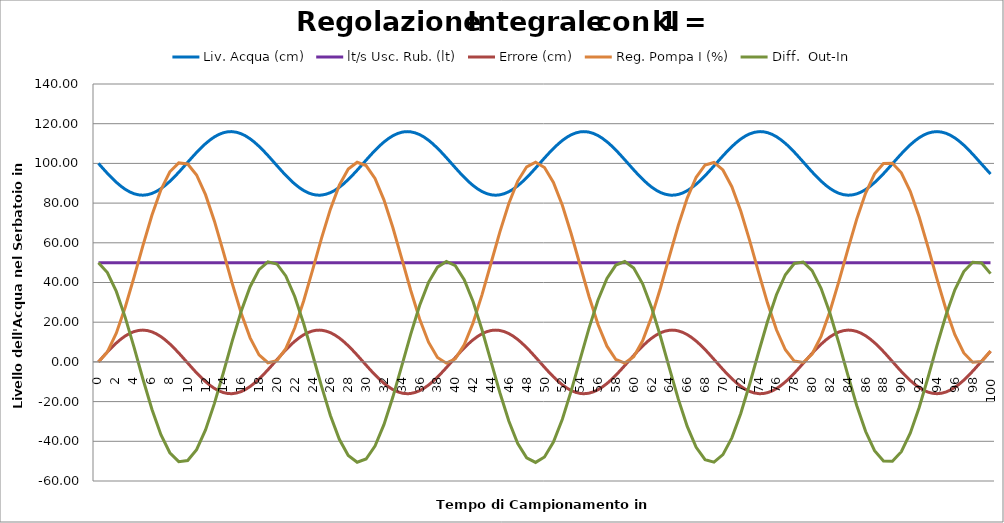
| Category | Liv. Acqua (cm) | lt/s Usc. Rub. (lt) | Errore (cm) | Reg. Pompa I (%) | Diff.  Out-In |
|---|---|---|---|---|---|
| 0.0 | 100 | 50 | 0 | 0 | 50 |
| 1.0 | 95 | 50 | 5 | 5 | 45 |
| 2.0 | 90.5 | 50 | 9.5 | 14.5 | 35.5 |
| 3.0 | 86.95 | 50 | 13.05 | 27.55 | 22.45 |
| 4.0 | 84.705 | 50 | 15.295 | 42.845 | 7.155 |
| 5.0 | 83.989 | 50 | 16.011 | 58.856 | -8.856 |
| 6.0 | 84.875 | 50 | 15.125 | 73.98 | -23.98 |
| 7.0 | 87.273 | 50 | 12.727 | 86.707 | -36.707 |
| 8.0 | 90.944 | 50 | 9.056 | 95.764 | -45.764 |
| 9.0 | 95.52 | 50 | 4.48 | 100.243 | -50.243 |
| 10.0 | 100.545 | 50 | -0.545 | 99.699 | -49.699 |
| 11.0 | 105.514 | 50 | -5.514 | 94.184 | -44.184 |
| 12.0 | 109.933 | 50 | -9.933 | 84.252 | -34.252 |
| 13.0 | 113.358 | 50 | -13.358 | 70.894 | -20.894 |
| 14.0 | 115.447 | 50 | -15.447 | 55.446 | -5.446 |
| 15.0 | 115.992 | 50 | -15.992 | 39.454 | 10.546 |
| 16.0 | 114.937 | 50 | -14.937 | 24.517 | 25.483 |
| 17.0 | 112.389 | 50 | -12.389 | 12.128 | 37.872 |
| 18.0 | 108.602 | 50 | -8.602 | 3.526 | 46.474 |
| 19.0 | 103.954 | 50 | -3.954 | -0.429 | 50.429 |
| 20.0 | 98.912 | 50 | 1.088 | 0.66 | 49.34 |
| 21.0 | 93.978 | 50 | 6.022 | 6.682 | 43.318 |
| 22.0 | 89.646 | 50 | 10.354 | 17.036 | 32.964 |
| 23.0 | 86.349 | 50 | 13.651 | 30.687 | 19.313 |
| 24.0 | 84.418 | 50 | 15.582 | 46.269 | 3.731 |
| 25.0 | 84.045 | 50 | 15.955 | 62.224 | -12.224 |
| 26.0 | 85.267 | 50 | 14.733 | 76.956 | -26.956 |
| 27.0 | 87.963 | 50 | 12.037 | 88.993 | -38.993 |
| 28.0 | 91.862 | 50 | 8.138 | 97.131 | -47.131 |
| 29.0 | 96.575 | 50 | 3.425 | 100.555 | -50.555 |
| 30.0 | 101.631 | 50 | -1.631 | 98.924 | -48.924 |
| 31.0 | 106.523 | 50 | -6.523 | 92.401 | -42.401 |
| 32.0 | 110.764 | 50 | -10.764 | 81.637 | -31.637 |
| 33.0 | 113.927 | 50 | -13.927 | 67.71 | -17.71 |
| 34.0 | 115.698 | 50 | -15.698 | 52.012 | -2.012 |
| 35.0 | 115.899 | 50 | -15.899 | 36.112 | 13.888 |
| 36.0 | 114.511 | 50 | -14.511 | 21.602 | 28.398 |
| 37.0 | 111.671 | 50 | -11.671 | 9.931 | 40.069 |
| 38.0 | 107.664 | 50 | -7.664 | 2.267 | 47.733 |
| 39.0 | 102.891 | 50 | -2.891 | -0.624 | 50.624 |
| 40.0 | 97.828 | 50 | 2.172 | 1.548 | 48.452 |
| 41.0 | 92.983 | 50 | 7.017 | 8.565 | 41.435 |
| 42.0 | 88.84 | 50 | 11.16 | 19.725 | 30.275 |
| 43.0 | 85.812 | 50 | 14.188 | 33.913 | 16.087 |
| 44.0 | 84.203 | 50 | 15.797 | 49.71 | 0.29 |
| 45.0 | 84.174 | 50 | 15.826 | 65.536 | -15.536 |
| 46.0 | 85.728 | 50 | 14.272 | 79.808 | -29.808 |
| 47.0 | 88.709 | 50 | 11.291 | 91.099 | -41.099 |
| 48.0 | 92.819 | 50 | 7.181 | 98.28 | -48.28 |
| 49.0 | 97.647 | 50 | 2.353 | 100.634 | -50.634 |
| 50.0 | 102.71 | 50 | -2.71 | 97.924 | -47.924 |
| 51.0 | 107.502 | 50 | -7.502 | 90.421 | -40.421 |
| 52.0 | 111.545 | 50 | -11.545 | 78.877 | -28.877 |
| 53.0 | 114.432 | 50 | -14.432 | 64.445 | -14.445 |
| 54.0 | 115.877 | 50 | -15.877 | 48.568 | 1.432 |
| 55.0 | 115.733 | 50 | -15.733 | 32.835 | 17.165 |
| 56.0 | 114.017 | 50 | -14.017 | 18.818 | 31.182 |
| 57.0 | 110.899 | 50 | -10.899 | 7.919 | 42.081 |
| 58.0 | 106.691 | 50 | -6.691 | 1.228 | 48.772 |
| 59.0 | 101.813 | 50 | -1.813 | -0.585 | 50.585 |
| 60.0 | 96.755 | 50 | 3.245 | 2.66 | 47.34 |
| 61.0 | 92.021 | 50 | 7.979 | 10.639 | 39.361 |
| 62.0 | 88.085 | 50 | 11.915 | 22.554 | 27.446 |
| 63.0 | 85.34 | 50 | 14.66 | 37.214 | 12.786 |
| 64.0 | 84.062 | 50 | 15.938 | 53.152 | -3.152 |
| 65.0 | 84.377 | 50 | 15.623 | 68.776 | -18.776 |
| 66.0 | 86.254 | 50 | 13.746 | 82.521 | -32.521 |
| 67.0 | 89.507 | 50 | 10.493 | 93.014 | -43.014 |
| 68.0 | 93.808 | 50 | 6.192 | 99.206 | -49.206 |
| 69.0 | 98.729 | 50 | 1.271 | 100.478 | -50.478 |
| 70.0 | 103.776 | 50 | -3.776 | 96.701 | -46.701 |
| 71.0 | 108.447 | 50 | -8.447 | 88.255 | -38.255 |
| 72.0 | 112.272 | 50 | -12.272 | 75.983 | -25.983 |
| 73.0 | 114.87 | 50 | -14.87 | 61.112 | -11.112 |
| 74.0 | 115.982 | 50 | -15.982 | 45.131 | 4.869 |
| 75.0 | 115.495 | 50 | -15.495 | 29.636 | 20.364 |
| 76.0 | 113.458 | 50 | -13.458 | 16.178 | 33.822 |
| 77.0 | 110.076 | 50 | -10.076 | 6.102 | 43.898 |
| 78.0 | 105.686 | 50 | -5.686 | 0.416 | 49.584 |
| 79.0 | 100.728 | 50 | -0.728 | -0.312 | 50.312 |
| 80.0 | 95.697 | 50 | 4.303 | 3.991 | 46.009 |
| 81.0 | 91.096 | 50 | 8.904 | 12.895 | 37.105 |
| 82.0 | 87.385 | 50 | 12.615 | 25.51 | 24.49 |
| 83.0 | 84.936 | 50 | 15.064 | 40.574 | 9.426 |
| 84.0 | 83.994 | 50 | 16.006 | 56.58 | -6.58 |
| 85.0 | 84.652 | 50 | 15.348 | 71.929 | -21.929 |
| 86.0 | 86.845 | 50 | 13.155 | 85.084 | -35.084 |
| 87.0 | 90.353 | 50 | 9.647 | 94.731 | -44.731 |
| 88.0 | 94.826 | 50 | 5.174 | 99.905 | -49.905 |
| 89.0 | 99.817 | 50 | 0.183 | 100.088 | -50.088 |
| 90.0 | 104.825 | 50 | -4.825 | 95.263 | -45.263 |
| 91.0 | 109.352 | 50 | -9.352 | 85.911 | -35.911 |
| 92.0 | 112.943 | 50 | -12.943 | 72.968 | -22.968 |
| 93.0 | 115.24 | 50 | -15.24 | 57.729 | -7.729 |
| 94.0 | 116.013 | 50 | -16.013 | 41.716 | 8.284 |
| 95.0 | 115.184 | 50 | -15.184 | 26.532 | 23.468 |
| 96.0 | 112.837 | 50 | -12.837 | 13.695 | 36.305 |
| 97.0 | 109.207 | 50 | -9.207 | 4.488 | 45.512 |
| 98.0 | 104.656 | 50 | -4.656 | -0.168 | 50.168 |
| 99.0 | 99.639 | 50 | 0.361 | 0.193 | 49.807 |
| 100.0 | 94.658 | 50 | 5.342 | 5.535 | 44.465 |